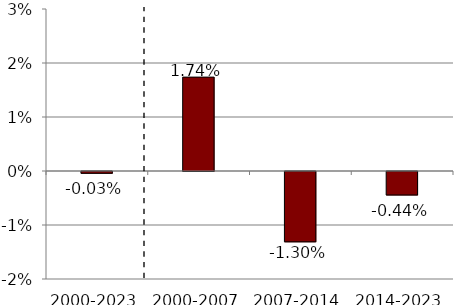
| Category | 60/40 |
|---|---|
| 2000-2023 | 0 |
| 2000-2007 | 0.017 |
| 2007-2014 | -0.013 |
| 2014-2023 | -0.004 |